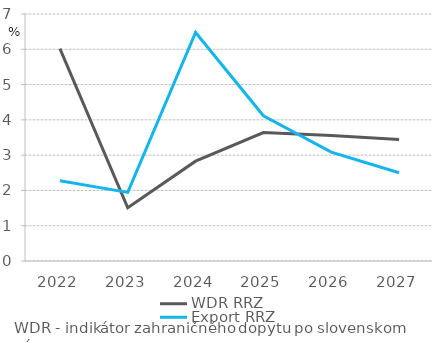
| Category | WDR RRZ | Export RRZ |
|---|---|---|
| 2022.0 | 6.021 | 2.275 |
| 2023.0 | 1.51 | 1.943 |
| 2024.0 | 2.83 | 6.476 |
| 2025.0 | 3.64 | 4.117 |
| 2026.0 | 3.56 | 3.085 |
| 2027.0 | 3.44 | 2.502 |